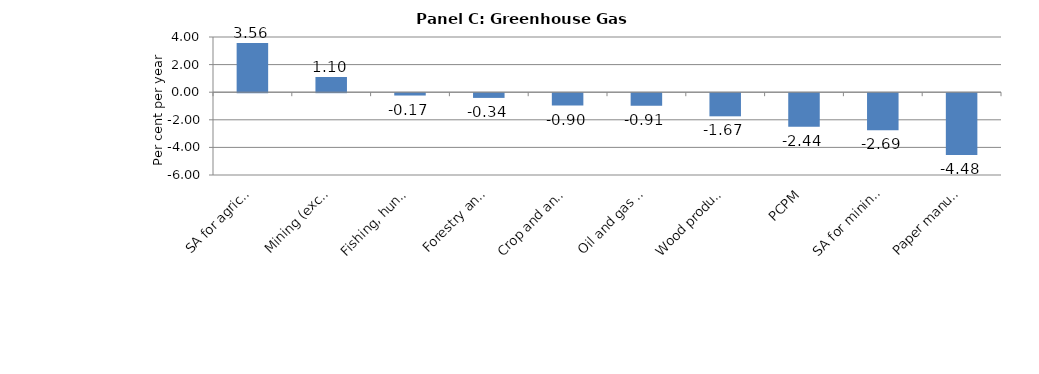
| Category | Series 0 |
|---|---|
| SA for agriculture and forestry | 3.562 |
| Mining (except oil and gas) | 1.103 |
| Fishing, hunting and trapping | -0.168 |
| Forestry and logging | -0.341 |
| Crop and animal production | -0.897 |
| Oil and gas extraction | -0.91 |
| Wood product manufacturing | -1.675 |
| PCPM | -2.438 |
| SA for mining and oil and gas | -2.69 |
| Paper manufacturing | -4.485 |